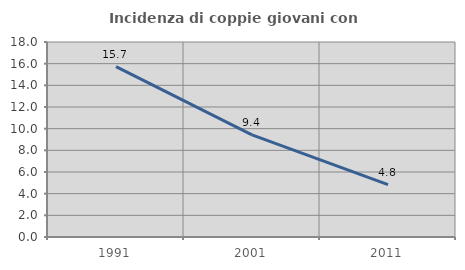
| Category | Incidenza di coppie giovani con figli |
|---|---|
| 1991.0 | 15.72 |
| 2001.0 | 9.425 |
| 2011.0 | 4.829 |